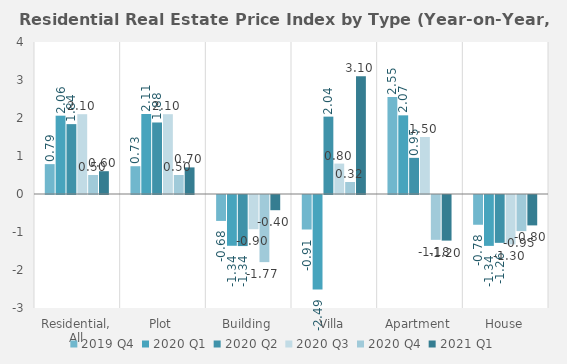
| Category | 2019 | 2020 | 2021 |
|---|---|---|---|
| Residential, All | 0.786 | 0.5 | 0.6 |
| Plot | 0.731 | 0.5 | 0.7 |
| Building | -0.682 | -1.766 | -0.4 |
| Villa | -0.908 | 0.316 | 3.1 |
| Apartment | 2.55 | -1.18 | -1.2 |
| House | -0.783 | -0.95 | -0.8 |